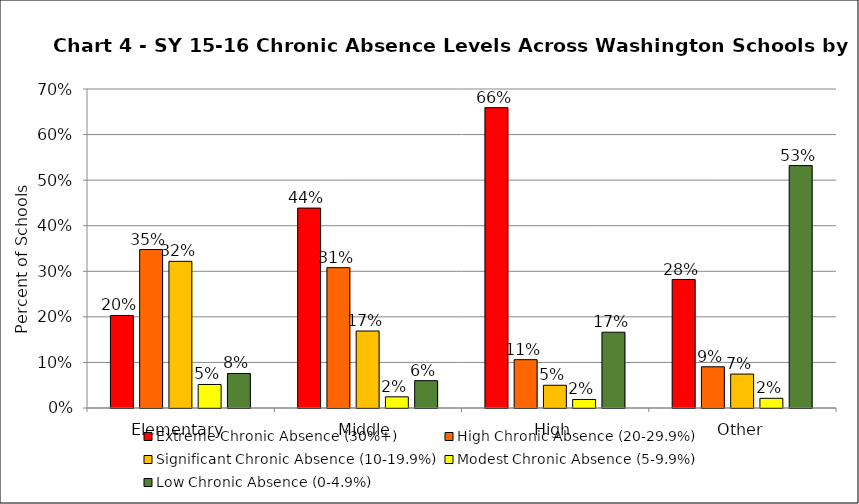
| Category | Extreme Chronic Absence (30%+) | High Chronic Absence (20-29.9%) | Significant Chronic Absence (10-19.9%) | Modest Chronic Absence (5-9.9%) | Low Chronic Absence (0-4.9%) |
|---|---|---|---|---|---|
| 0 | 0.203 | 0.348 | 0.322 | 0.052 | 0.076 |
| 1 | 0.439 | 0.308 | 0.169 | 0.025 | 0.06 |
| 2 | 0.659 | 0.106 | 0.05 | 0.019 | 0.166 |
| 3 | 0.282 | 0.09 | 0.074 | 0.021 | 0.532 |